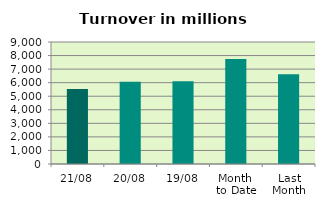
| Category | Series 0 |
|---|---|
| 21/08 | 5534.777 |
| 20/08 | 6069.072 |
| 19/08 | 6108.56 |
| Month 
to Date | 7754.327 |
| Last
Month | 6625.077 |